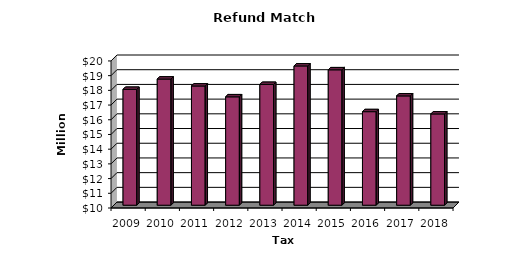
| Category | Total |
|---|---|
| 2009.0 | 17.876 |
| 2010.0 | 18.578 |
| 2011.0 | 18.105 |
| 2012.0 | 17.369 |
| 2013.0 | 18.212 |
| 2014.0 | 19.469 |
| 2015.0 | 19.206 |
| 2016.0 | 16.36 |
| 2017.0 | 17.432 |
| 2018.0 | 16.204 |